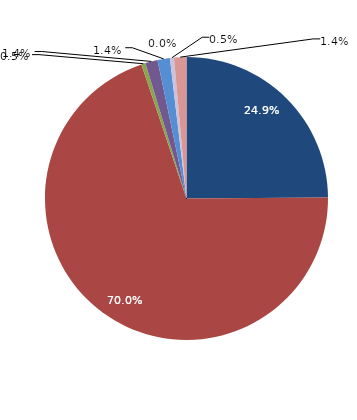
| Category | Series 0 |
|---|---|
| قبل الدخول
Before Consummation | 24.883 |
| -1 | 69.953 |
| 1 | 0.469 |
| 2 | 1.408 |
| 3 | 1.408 |
| 4 | 0 |
|  5 - 9 | 0.469 |
| 10+ | 1.408 |